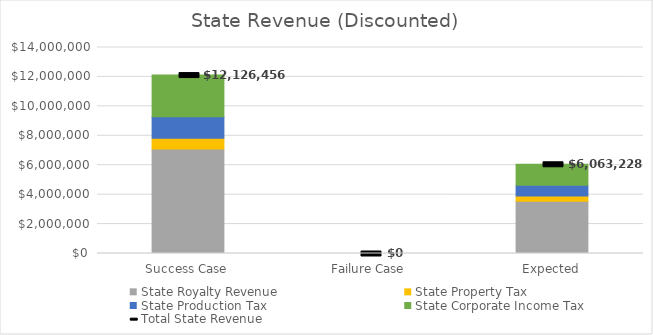
| Category | State Royalty Revenue | State Property Tax | State Production Tax | State Corporate Income Tax |
|---|---|---|---|---|
| Success Case | 7099020.453 | 727634.831 | 1465947.724 | 2833853.408 |
| Failure Case | 0 | 0 | 0 | 0 |
| Expected | 3549510.227 | 363817.416 | 732973.862 | 1416926.704 |